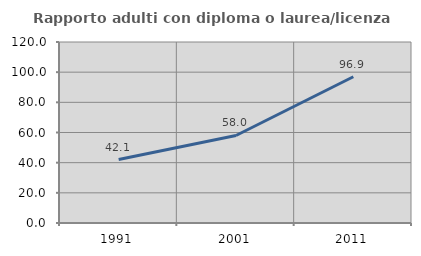
| Category | Rapporto adulti con diploma o laurea/licenza media  |
|---|---|
| 1991.0 | 42.07 |
| 2001.0 | 58.013 |
| 2011.0 | 96.949 |